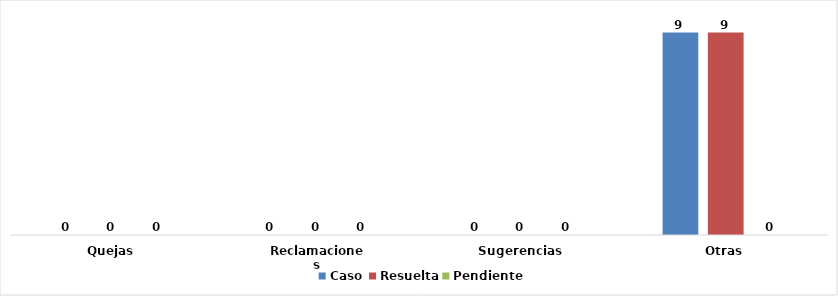
| Category | Caso | Resuelta | Pendiente |
|---|---|---|---|
| Quejas | 0 | 0 | 0 |
| Reclamaciones | 0 | 0 | 0 |
| Sugerencias | 0 | 0 | 0 |
| Otras | 9 | 9 | 0 |